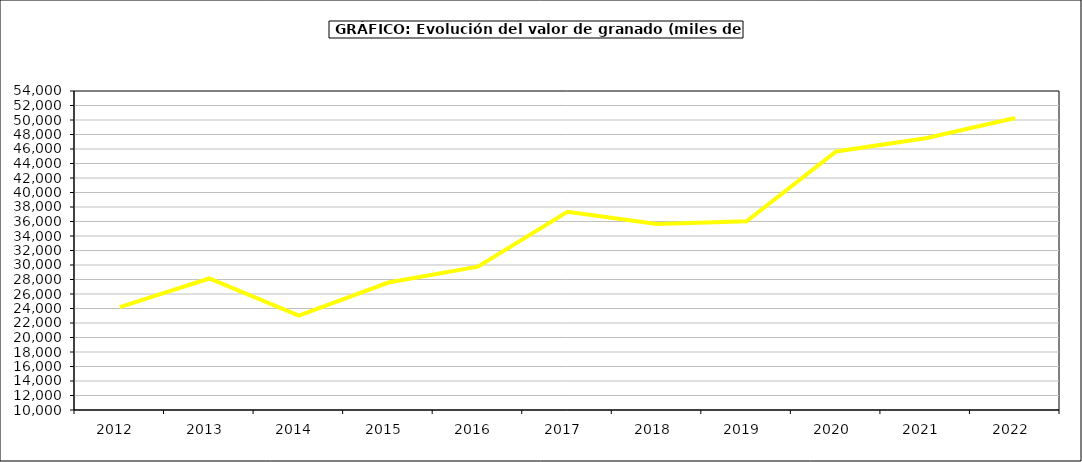
| Category | valor granado |
|---|---|
| 2012.0 | 24185.236 |
| 2013.0 | 28138.938 |
| 2014.0 | 23031.365 |
| 2015.0 | 27581 |
| 2016.0 | 29763 |
| 2017.0 | 37333.028 |
| 2018.0 | 35641.983 |
| 2019.0 | 36035.866 |
| 2020.0 | 45669.441 |
| 2021.0 | 47492.969 |
| 2022.0 | 50281.205 |